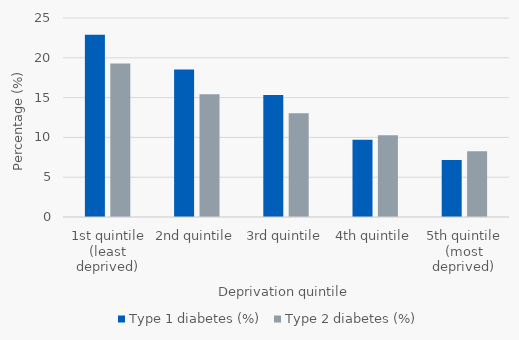
| Category | Type 1 diabetes (%) | Type 2 diabetes (%) |
|---|---|---|
| 1st quintile (least deprived) | 22.892 | 19.289 |
| 2nd quintile | 18.519 | 15.408 |
| 3rd quintile | 15.318 | 13.043 |
| 4th quintile | 9.693 | 10.279 |
| 5th quintile (most deprived) | 7.164 | 8.265 |